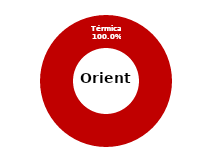
| Category | Oriente |
|---|---|
| Eólica | 0 |
| Hidráulica | 0 |
| Solar | 0 |
| Térmica | 34.188 |